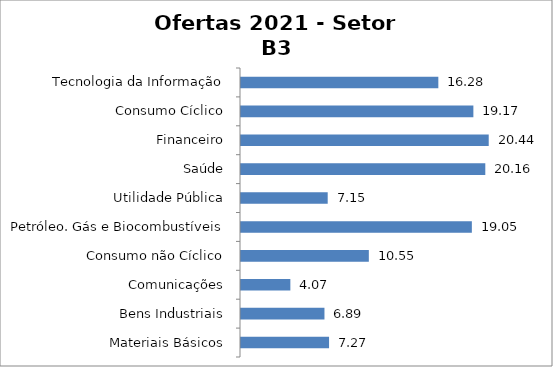
| Category | Setor B3 |
|---|---|
| Tecnologia da Informação | 16281828059.4 |
| Consumo Cíclico | 19172538091.7 |
| Financeiro | 20438886050.12 |
| Saúde | 20156555819.68 |
| Utilidade Pública | 7153575212.64 |
| Petróleo. Gás e Biocombustíveis | 19047222996 |
| Consumo não Cíclico | 10547319915.8 |
| Comunicações | 4072426585.12 |
| Bens Industriais | 6886152407.89 |
| Materiais Básicos | 7265251970.4 |